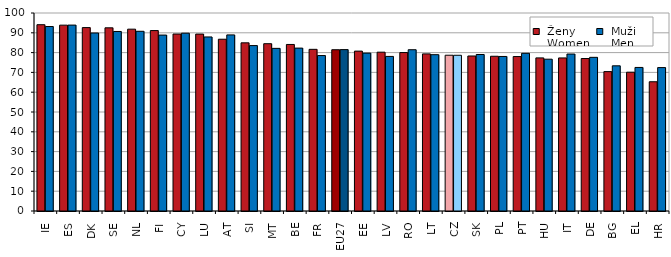
| Category |  Ženy 
 Women |  Muži 
 Men |
|---|---|---|
| IE | 94.089 | 93.169 |
| ES | 93.866 | 93.897 |
| DK | 92.622 | 89.9 |
| SE | 92.511 | 90.67 |
| NL | 91.84 | 90.766 |
| FI | 91.125 | 88.855 |
| CY | 89.379 | 89.803 |
| LU | 89.352 | 87.907 |
| AT | 86.752 | 88.943 |
| SI | 84.934 | 83.546 |
| MT | 84.494 | 82.134 |
| BE | 84.11 | 82.272 |
| FR | 81.645 | 78.511 |
| EU27 | 81.448 | 81.508 |
| EE | 80.751 | 79.742 |
| LV | 80.213 | 78.074 |
| RO | 80.021 | 81.451 |
| LT | 79.355 | 78.95 |
| CZ | 78.671 | 78.653 |
| SK | 78.284 | 79.038 |
| PL | 78.15 | 78.054 |
| PT | 78 | 79.645 |
| HU | 77.336 | 76.67 |
| IT | 77.308 | 79.273 |
| DE | 77.009 | 77.606 |
| BG | 70.395 | 73.323 |
| EL | 70.095 | 72.5 |
| HR | 65.275 | 72.431 |